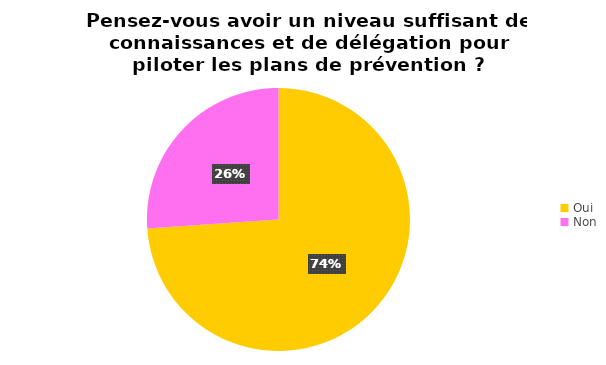
| Category | Series 0 |
|---|---|
| Oui | 34 |
| Non | 12 |